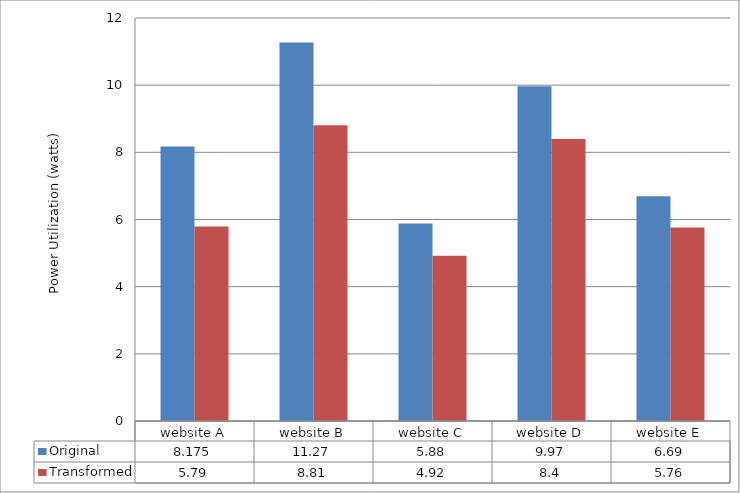
| Category | Original | Transformed |
|---|---|---|
| website A | 8.175 | 5.79 |
| website B | 11.27 | 8.81 |
| website C | 5.88 | 4.92 |
| website D | 9.97 | 8.4 |
| website E | 6.69 | 5.76 |